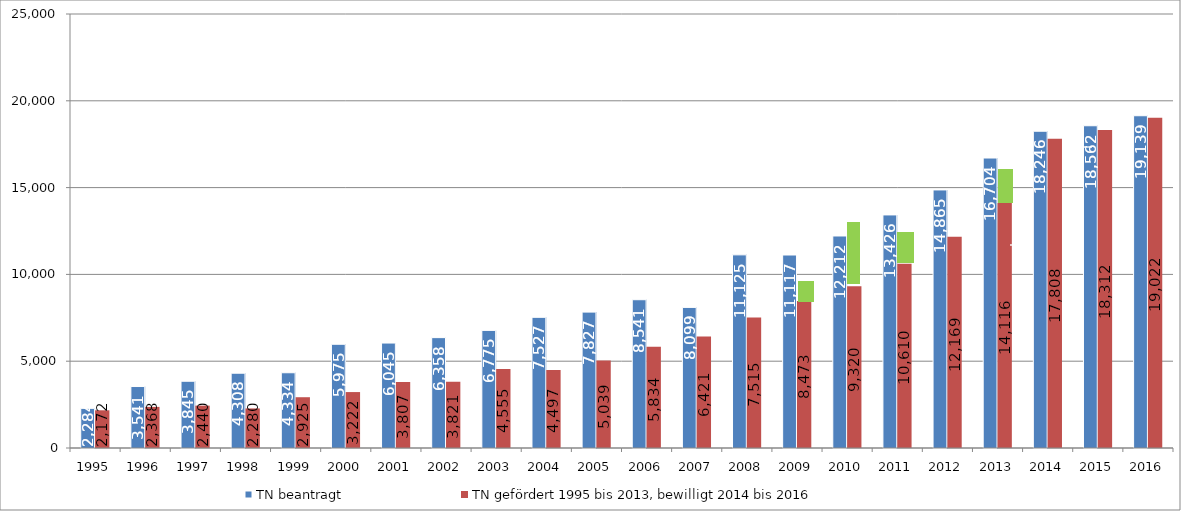
| Category | TN beantragt | TN gefördert 1995 bis 2013, bewilligt 2014 bis 2016 |
|---|---|---|
| 1995 | 2284 | 2172 |
| 1996 | 3541 | 2368 |
| 1997 | 3845 | 2440 |
| 1998 | 4308 | 2280 |
| 1999 | 4334 | 2925 |
| 2000 | 5975 | 3222 |
| 2001 | 6045 | 3807 |
| 2002 | 6358 | 3821 |
| 2003 | 6775 | 4555 |
| 2004 | 7527 | 4497 |
| 2005 | 7827 | 5039 |
| 2006 | 8541 | 5834 |
| 2007 | 8099 | 6421 |
| 2008 | 11125 | 7515 |
| 2009 | 11117 | 8473 |
| 2010 | 12212 | 9320 |
| 2011 | 13426 | 10610 |
| 2012 | 14865 | 12169 |
| 2013 | 16704 | 14116 |
| 2014 | 18246 | 17808 |
| 2015 | 18562 | 18312 |
| 2016 | 19139 | 19022 |